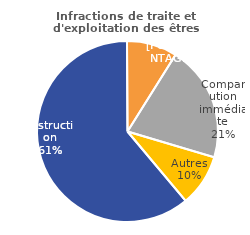
| Category | Infractions de traite et d'exploitation des êtres humains |
|---|---|
| Instruction | 61.022 |
| COPJ* | 8.995 |
| Comparution immédiate | 20.697 |
| Autres | 9.287 |